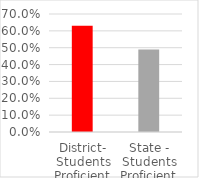
| Category | Series 2 |
|---|---|
| District- Students Proficient | 0.63 |
| State - Students Proficient | 0.49 |